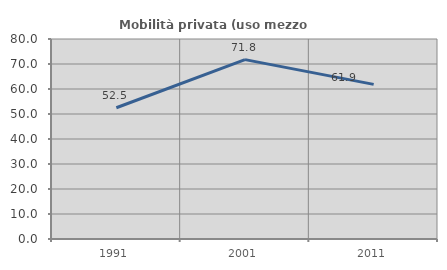
| Category | Mobilità privata (uso mezzo privato) |
|---|---|
| 1991.0 | 52.5 |
| 2001.0 | 71.761 |
| 2011.0 | 61.856 |